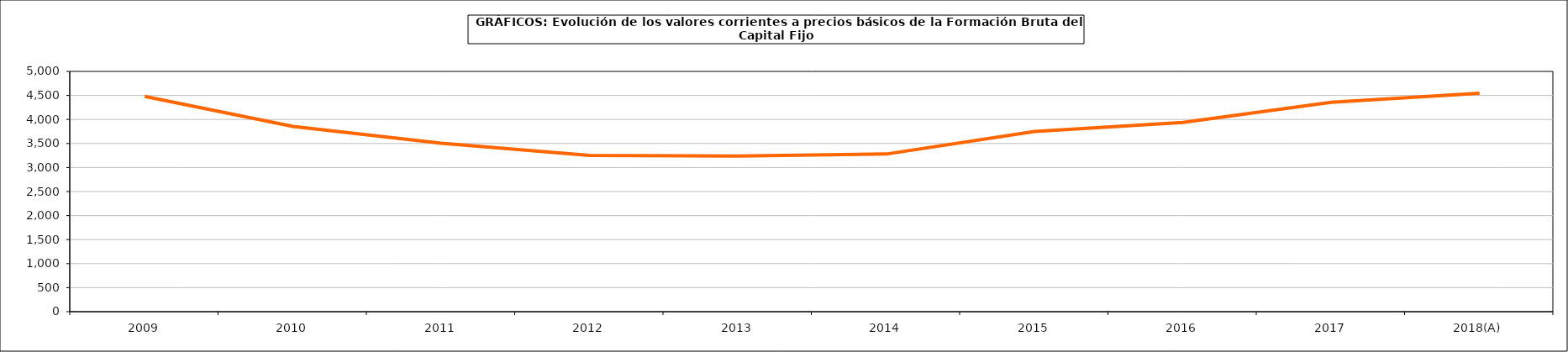
| Category | Formación bruta del capital fijo |
|---|---|
| 2009 | 4480.333 |
| 2010 | 3854.681 |
| 2011 | 3505.623 |
| 2012 | 3252.938 |
| 2013 | 3238.024 |
| 2014 | 3280.426 |
| 2015 | 3750.103 |
| 2016 | 3936.283 |
| 2017 | 4356.844 |
| 2018(A) | 4543.411 |